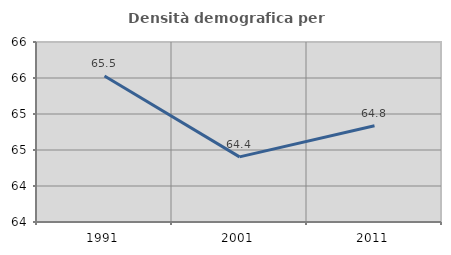
| Category | Densità demografica |
|---|---|
| 1991.0 | 65.529 |
| 2001.0 | 64.404 |
| 2011.0 | 64.837 |